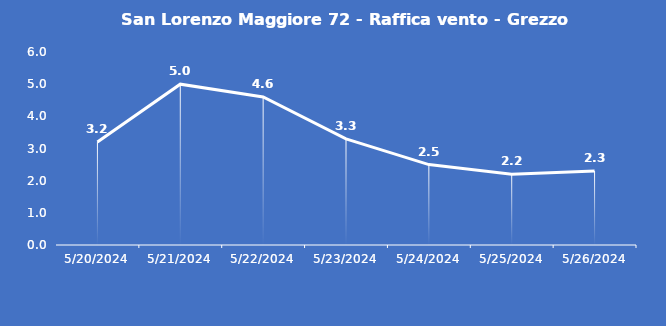
| Category | San Lorenzo Maggiore 72 - Raffica vento - Grezzo (m/s) |
|---|---|
| 5/20/24 | 3.2 |
| 5/21/24 | 5 |
| 5/22/24 | 4.6 |
| 5/23/24 | 3.3 |
| 5/24/24 | 2.5 |
| 5/25/24 | 2.2 |
| 5/26/24 | 2.3 |